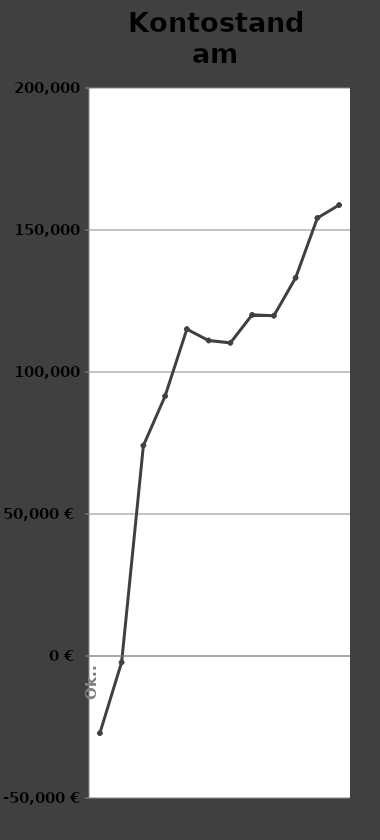
| Category | Kontostand am Monatsende |
|---|---|
| 2019-10-01 | -27161 |
| 2019-11-01 | -2222 |
| 2019-12-01 | 74112 |
| 2020-01-01 | 91521 |
| 2020-02-01 | 115110 |
| 2020-03-01 | 111099 |
| 2020-04-01 | 110266 |
| 2020-05-01 | 120105 |
| 2020-06-01 | 119819 |
| 2020-07-01 | 133164 |
| 2020-08-01 | 154253 |
| 2020-09-01 | 158787 |